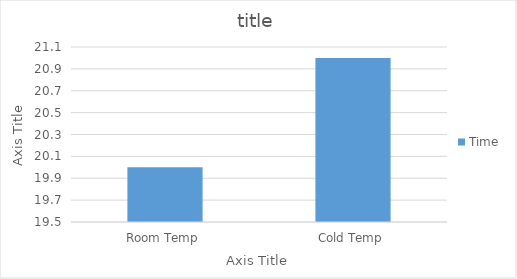
| Category | Time |
|---|---|
| Room Temp | 20 |
| Cold Temp | 21 |